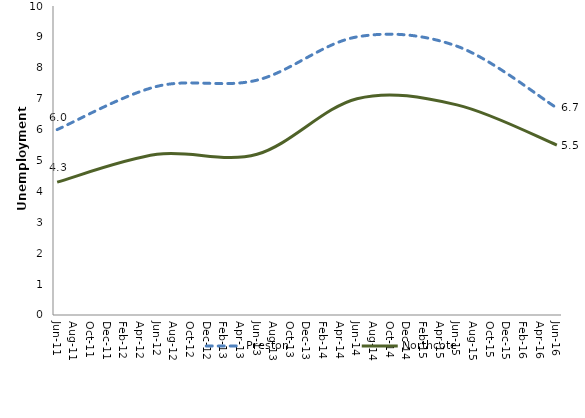
| Category | Preston | Northcote |
|---|---|---|
| 2011-06-01 | 6 | 4.3 |
| 2012-06-01 | 7.4 | 5.2 |
| 2013-06-01 | 7.6 | 5.2 |
| 2014-06-01 | 9 | 7 |
| 2015-06-01 | 8.7 | 6.8 |
| 2016-06-01 | 6.7 | 5.5 |